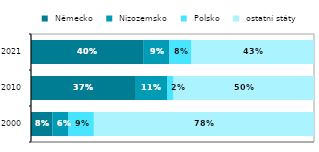
| Category |  Německo |  Nizozemsko |  Polsko |  ostatní státy |
|---|---|---|---|---|
| 2000 | 0.076 | 0.056 | 0.09 | 0.778 |
| 2010 | 0.371 | 0.11 | 0.023 | 0.496 |
| 2021 | 0.396 | 0.093 | 0.078 | 0.433 |